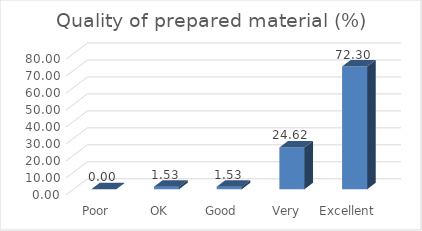
| Category | Quality of prepared material (%) |
|---|---|
| Poor | 0 |
| OK | 1.53 |
| Good | 1.53 |
| Very Good | 24.62 |
| Excellent | 72.3 |